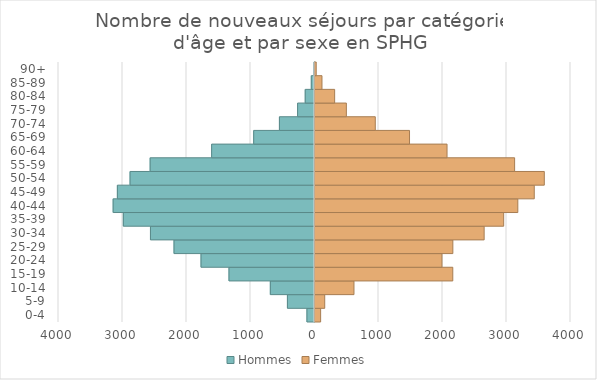
| Category | Hommes | Femmes |
|---|---|---|
| 0-4 | -118 | 88 |
| 5-9 | -423 | 152 |
| 10-14 | -690 | 609 |
| 15-19 | -1336 | 2153 |
| 20-24 | -1773 | 1984 |
| 25-29 | -2195 | 2154 |
| 30-34 | -2563 | 2643 |
| 35-39 | -2987 | 2948 |
| 40-44 | -3146 | 3169 |
| 45-49 | -3080 | 3426 |
| 50-54 | -2882 | 3583 |
| 55-59 | -2568 | 3119 |
| 60-64 | -1607 | 2063 |
| 65-69 | -950 | 1477 |
| 70-74 | -548 | 942 |
| 75-79 | -264 | 490 |
| 80-84 | -145 | 307 |
| 85-89 | -50 | 109 |
| 90+ | -9 | 19 |